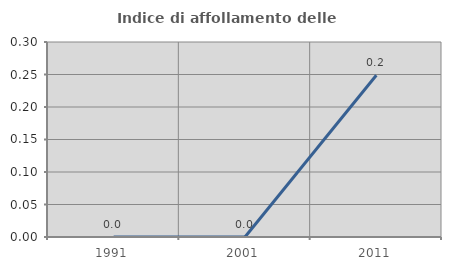
| Category | Indice di affollamento delle abitazioni  |
|---|---|
| 1991.0 | 0 |
| 2001.0 | 0 |
| 2011.0 | 0.249 |